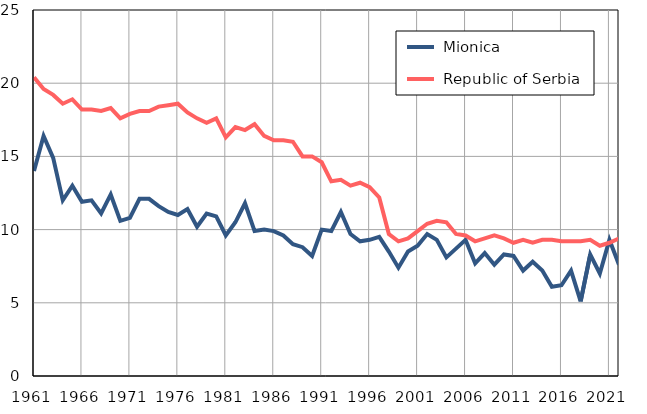
| Category |  Mionica |  Republic of Serbia |
|---|---|---|
| 1961.0 | 14 | 20.4 |
| 1962.0 | 16.4 | 19.6 |
| 1963.0 | 14.9 | 19.2 |
| 1964.0 | 12 | 18.6 |
| 1965.0 | 13 | 18.9 |
| 1966.0 | 11.9 | 18.2 |
| 1967.0 | 12 | 18.2 |
| 1968.0 | 11.1 | 18.1 |
| 1969.0 | 12.4 | 18.3 |
| 1970.0 | 10.6 | 17.6 |
| 1971.0 | 10.8 | 17.9 |
| 1972.0 | 12.1 | 18.1 |
| 1973.0 | 12.1 | 18.1 |
| 1974.0 | 11.6 | 18.4 |
| 1975.0 | 11.2 | 18.5 |
| 1976.0 | 11 | 18.6 |
| 1977.0 | 11.4 | 18 |
| 1978.0 | 10.2 | 17.6 |
| 1979.0 | 11.1 | 17.3 |
| 1980.0 | 10.9 | 17.6 |
| 1981.0 | 9.6 | 16.3 |
| 1982.0 | 10.5 | 17 |
| 1983.0 | 11.8 | 16.8 |
| 1984.0 | 9.9 | 17.2 |
| 1985.0 | 10 | 16.4 |
| 1986.0 | 9.9 | 16.1 |
| 1987.0 | 9.6 | 16.1 |
| 1988.0 | 9 | 16 |
| 1989.0 | 8.8 | 15 |
| 1990.0 | 8.2 | 15 |
| 1991.0 | 10 | 14.6 |
| 1992.0 | 9.9 | 13.3 |
| 1993.0 | 11.2 | 13.4 |
| 1994.0 | 9.7 | 13 |
| 1995.0 | 9.2 | 13.2 |
| 1996.0 | 9.3 | 12.9 |
| 1997.0 | 9.5 | 12.2 |
| 1998.0 | 8.5 | 9.7 |
| 1999.0 | 7.4 | 9.2 |
| 2000.0 | 8.5 | 9.4 |
| 2001.0 | 8.9 | 9.9 |
| 2002.0 | 9.7 | 10.4 |
| 2003.0 | 9.3 | 10.6 |
| 2004.0 | 8.1 | 10.5 |
| 2005.0 | 8.7 | 9.7 |
| 2006.0 | 9.3 | 9.6 |
| 2007.0 | 7.7 | 9.2 |
| 2008.0 | 8.4 | 9.4 |
| 2009.0 | 7.6 | 9.6 |
| 2010.0 | 8.3 | 9.4 |
| 2011.0 | 8.2 | 9.1 |
| 2012.0 | 7.2 | 9.3 |
| 2013.0 | 7.8 | 9.1 |
| 2014.0 | 7.2 | 9.3 |
| 2015.0 | 6.1 | 9.3 |
| 2016.0 | 6.2 | 9.2 |
| 2017.0 | 7.2 | 9.2 |
| 2018.0 | 5.1 | 9.2 |
| 2019.0 | 8.3 | 9.3 |
| 2020.0 | 7 | 8.9 |
| 2021.0 | 9.3 | 9.1 |
| 2022.0 | 7.6 | 9.4 |